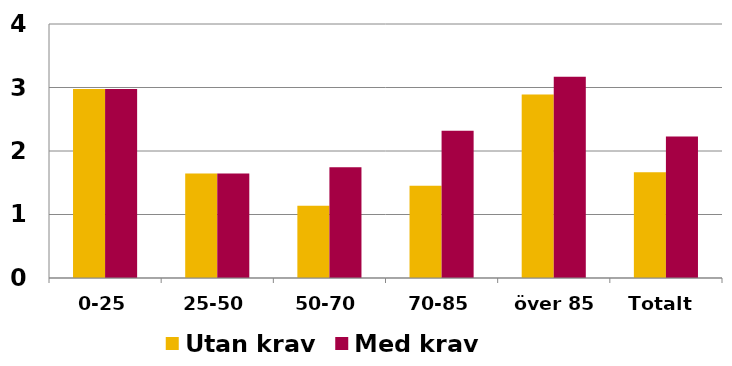
| Category | Utan krav | Med krav  |
|---|---|---|
| 0-25 | 2.977 | 2.977 |
| 25-50 | 1.645 | 1.645 |
| 50-70 | 1.14 | 1.744 |
| 70-85 | 1.453 | 2.319 |
| över 85 | 2.891 | 3.171 |
| Totalt  | 1.665 | 2.228 |